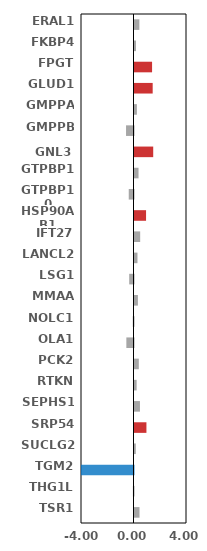
| Category | Series 0 |
|---|---|
| ERAL1 | 0.371 |
| FKBP4 | 0.115 |
| FPGT | 1.34 |
| GLUD1 | 1.385 |
| GMPPA | 0.182 |
| GMPPB | -0.569 |
| GNL3 | 1.426 |
| GTPBP1 | 0.307 |
| GTPBP10 | -0.363 |
| HSP90AB1 | 0.881 |
| IFT27 | 0.433 |
| LANCL2 | 0.226 |
| LSG1 | -0.328 |
| MMAA | 0.259 |
| NOLC1 | -0.057 |
| OLA1 | -0.544 |
| PCK2 | 0.328 |
| RTKN | 0.163 |
| SEPHS1 | 0.415 |
| SRP54 | 0.909 |
| SUCLG2 | 0.099 |
| TGM2 | -5.34 |
| THG1L | -0.048 |
| TSR1 | 0.382 |